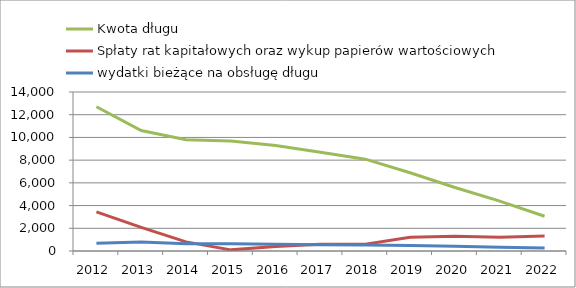
| Category | Kwota długu | Spłaty rat kapitałowych oraz wykup papierów wartościowych | wydatki bieżące na obsługę długu |
|---|---|---|---|
| 2012.0 | 12697841 | 3450772 | 679120 |
| 2013.0 | 10607700 | 2080291 | 790000 |
| 2014.0 | 9797850 | 800000 | 640000 |
| 2015.0 | 9688000 | 100000 | 645000 |
| 2016.0 | 9288000 | 400000 | 600000 |
| 2017.0 | 8688000 | 600000 | 557000 |
| 2018.0 | 8088000 | 600000 | 521000 |
| 2019.0 | 6888000 | 1200000 | 485000 |
| 2020.0 | 5588000 | 1300000 | 413000 |
| 2021.0 | 4388000 | 1200000 | 335000 |
| 2022.0 | 3058000 | 1330000 | 263000 |